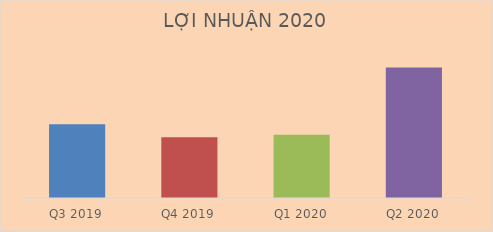
| Category | Doanh thu thuần |
|---|---|
| Q3 2019 | 436667614564 |
| Q4 2019 | 360173916947 |
| Q1 2020 | 375089468201 |
| Q2 2020 | 772165208970 |